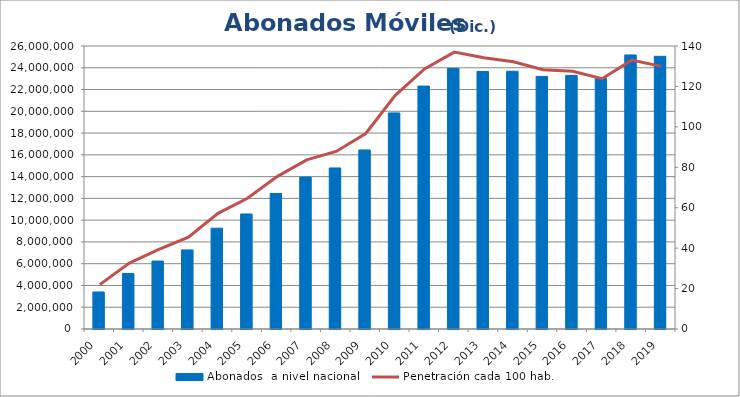
| Category | Abonados  a nivel nacional  |
|---|---|
| 2000.0 | 3401525 |
| 2001.0 | 5100783 |
| 2002.0 | 6244310 |
| 2003.0 | 7268281 |
| 2004.0 | 9261385 |
| 2005.0 | 10569572 |
| 2006.0 | 12450801 |
| 2007.0 | 13955202 |
| 2008.0 | 14796593 |
| 2009.0 | 16450223 |
| 2010.0 | 19852242 |
| 2011.0 | 22315248 |
| 2012.0 | 23940973 |
| 2013.0 | 23661339 |
| 2014.0 | 23680718 |
| 2015.0 | 23206353 |
| 2016.0 | 23302603 |
| 2017.0 | 23013147 |
| 2018.0 | 25178981 |
| 2019.0 | 25051668 |